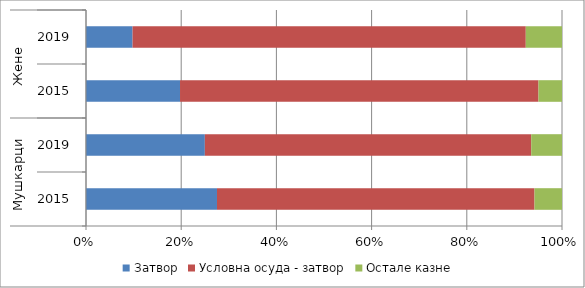
| Category | Затвор | Условна осуда - затвор | Остале казне  |
|---|---|---|---|
| 0 | 27.519 | 66.706 | 5.775 |
| 1 | 24.969 | 68.563 | 6.467 |
| 2 | 19.753 | 75.309 | 4.938 |
| 3 | 9.783 | 82.609 | 7.609 |